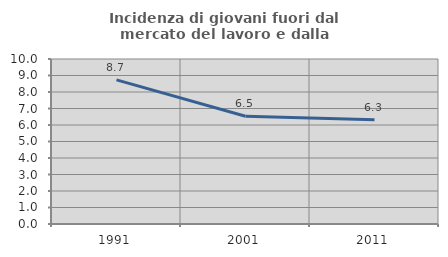
| Category | Incidenza di giovani fuori dal mercato del lavoro e dalla formazione  |
|---|---|
| 1991.0 | 8.735 |
| 2001.0 | 6.529 |
| 2011.0 | 6.312 |